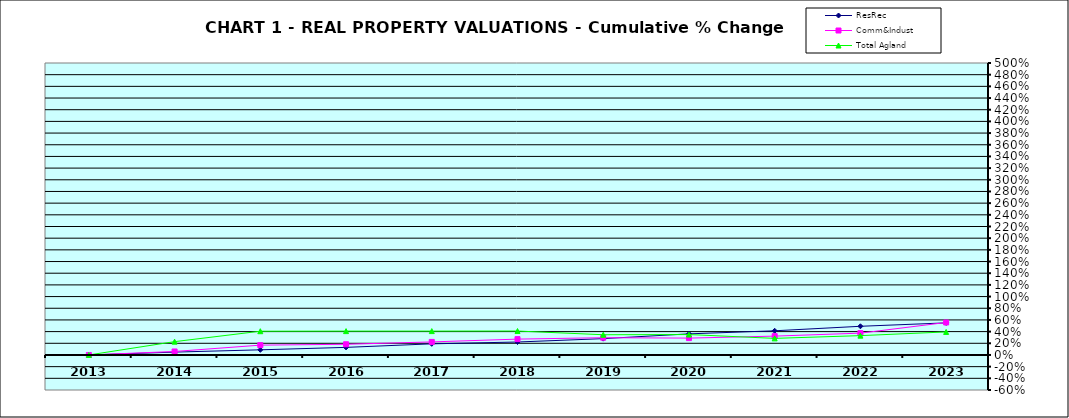
| Category | ResRec | Comm&Indust | Total Agland |
|---|---|---|---|
| 2013.0 | 0 | 0 | 0 |
| 2014.0 | 0.049 | 0.06 | 0.228 |
| 2015.0 | 0.088 | 0.168 | 0.407 |
| 2016.0 | 0.13 | 0.183 | 0.408 |
| 2017.0 | 0.19 | 0.223 | 0.409 |
| 2018.0 | 0.222 | 0.271 | 0.41 |
| 2019.0 | 0.279 | 0.296 | 0.346 |
| 2020.0 | 0.362 | 0.289 | 0.35 |
| 2021.0 | 0.414 | 0.323 | 0.284 |
| 2022.0 | 0.491 | 0.374 | 0.331 |
| 2023.0 | 0.549 | 0.556 | 0.394 |